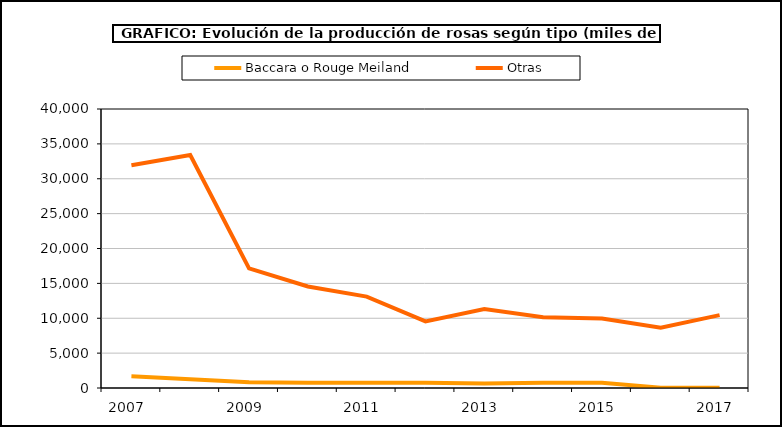
| Category | Baccara o Rouge Meiland | Otras |
|---|---|---|
| 2007.0 | 1675 | 31941 |
| 2008.0 | 1250 | 33407 |
| 2009.0 | 836 | 17147 |
| 2010.0 | 741 | 14560 |
| 2011.0 | 741 | 13099 |
| 2012.0 | 741 | 9551 |
| 2013.0 | 662 | 11331 |
| 2014.0 | 739 | 10158 |
| 2015.0 | 756 | 9969 |
| 2016.0 | 38 | 8644 |
| 2017.0 | 38 | 10442 |